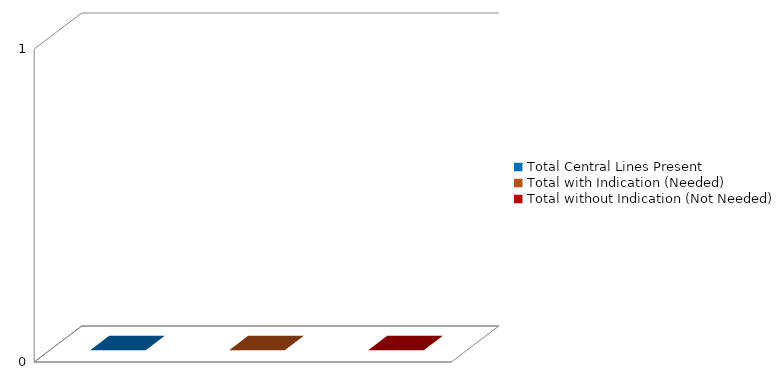
| Category | Series 0 |
|---|---|
| Total Central Lines Present | 0 |
| Total with Indication (Needed) | 0 |
| Total without Indication (Not Needed) | 0 |